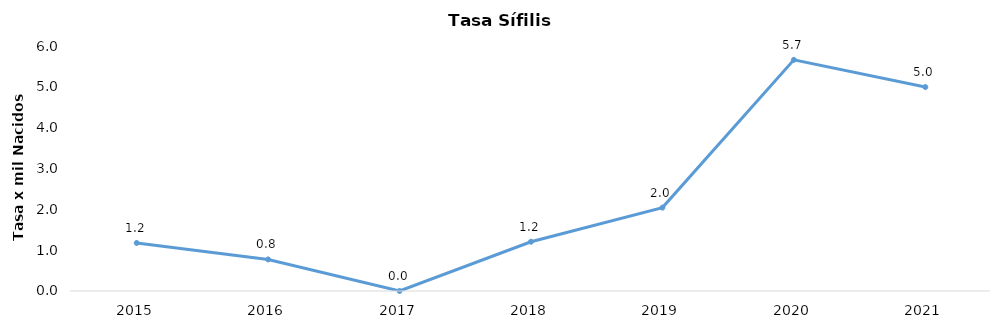
| Category | Sífilis Congénita |
|---|---|
| 0 | 1.176 |
| 1 | 0.773 |
| 2 | 0 |
| 3 | 1.207 |
| 4 | 2.042 |
| 5 | 5.661 |
| 6 | 4.995 |